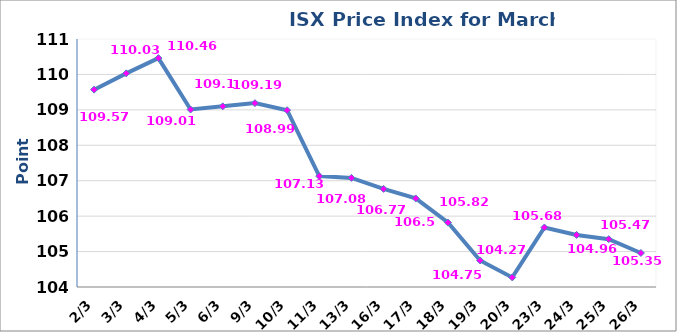
| Category | 2014 |
|---|---|
|  2/3 | 109.57 |
|  3/3 | 110.03 |
|  4/3 | 110.46 |
|  5/3 | 109.01 |
|  6/3 | 109.1 |
|  9/3 | 109.19 |
|  10/3 | 108.99 |
|  11/3 | 107.13 |
|  13/3 | 107.08 |
|  16/3 | 106.77 |
|  17/3 | 106.5 |
|  18/3 | 105.82 |
|  19/3 | 104.75 |
|  20/3 | 104.27 |
|  23/3 | 105.68 |
|  24/3 | 105.47 |
|  25/3 | 105.35 |
|  26/3 | 104.96 |